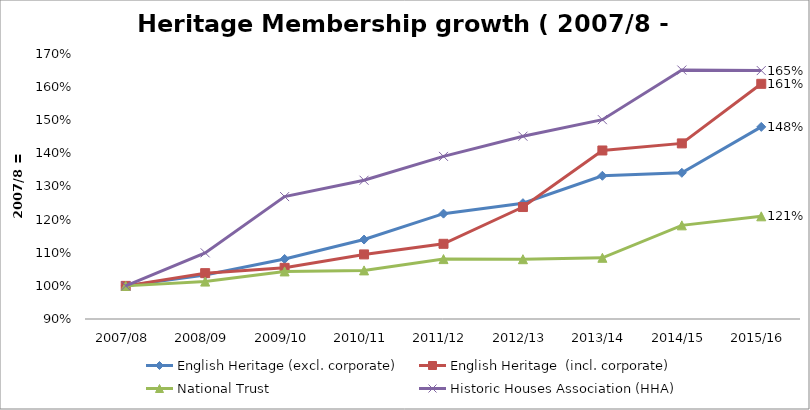
| Category | English Heritage (excl. corporate) | English Heritage  (incl. corporate) | National Trust  | Historic Houses Association (HHA)  |
|---|---|---|---|---|
| 2007/08 | 1 | 1 | 1 | 1 |
| 2008/09 | 1.033 | 1.038 | 1.013 | 1.1 |
| 2009/10 | 1.081 | 1.054 | 1.044 | 1.269 |
| 2010/11 | 1.14 | 1.095 | 1.047 | 1.319 |
| 2011/12 | 1.218 | 1.127 | 1.081 | 1.391 |
| 2012/13 | 1.25 | 1.238 | 1.08 | 1.452 |
| 2013/14 | 1.332 | 1.409 | 1.085 | 1.502 |
| 2014/15 | 1.341 | 1.43 | 1.183 | 1.652 |
| 2015/16 | 1.48 | 1.61 | 1.21 | 1.65 |